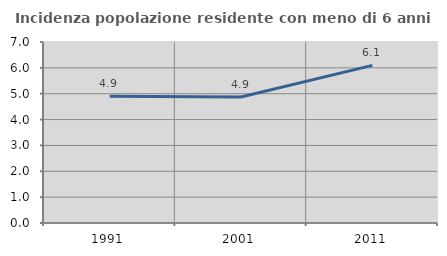
| Category | Incidenza popolazione residente con meno di 6 anni |
|---|---|
| 1991.0 | 4.902 |
| 2001.0 | 4.874 |
| 2011.0 | 6.096 |